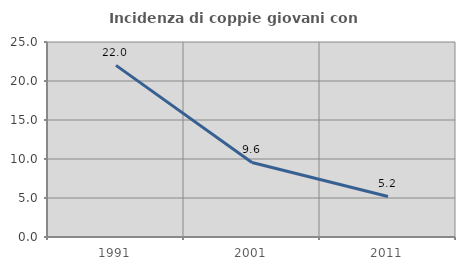
| Category | Incidenza di coppie giovani con figli |
|---|---|
| 1991.0 | 22.006 |
| 2001.0 | 9.562 |
| 2011.0 | 5.201 |